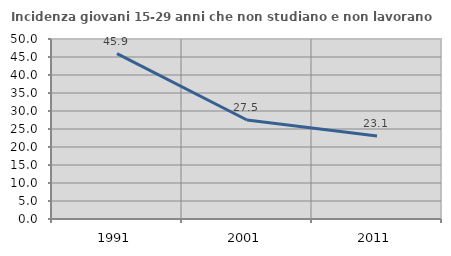
| Category | Incidenza giovani 15-29 anni che non studiano e non lavorano  |
|---|---|
| 1991.0 | 45.914 |
| 2001.0 | 27.491 |
| 2011.0 | 23.077 |